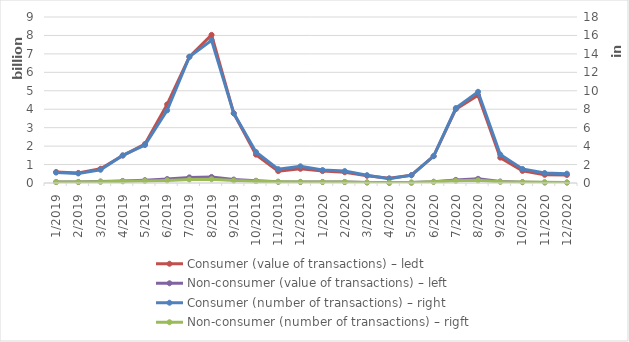
| Category | Consumer (value of transactions) – ledt | Non-consumer (value of transactions) – left |
|---|---|---|
| 1/2019 | 597453233 | 54649501 |
| 2/2019 | 544813653 | 57286423 |
| 3/2019 | 772543855 | 80652545 |
| 4/2019 | 1488036890 | 111202427 |
| 5/2019 | 2110447712 | 151509105 |
| 6/2019 | 4262918156 | 214072603 |
| 7/2019 | 6844145935 | 304996668 |
| 8/2019 | 8030233674 | 329496408 |
| 9/2019 | 3775430974 | 186529499 |
| 10/2019 | 1538309778 | 120944466 |
| 11/2019 | 644567725 | 66348906 |
| 12/2019 | 769942084 | 58144061 |
| 1/2020 | 645224709 | 56660603 |
| 2/2020 | 584451376 | 55942260 |
| 3/2020 | 391337702 | 31172779 |
| 4/2020 | 251649738 | 12860011 |
| 5/2020 | 421942351 | 22361298 |
| 6/2020 | 1455655654 | 69633995 |
| 7/2020 | 4005424300 | 167964224 |
| 8/2020 | 4759260227 | 226117200 |
| 9/2020 | 1375513636 | 79204701 |
| 10/2020 | 654920131 | 45565818 |
| 11/2020 | 445413535 | 32201878 |
| 12/2020 | 432596028 | 27387876 |